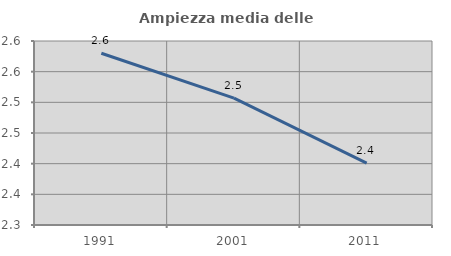
| Category | Ampiezza media delle famiglie |
|---|---|
| 1991.0 | 2.58 |
| 2001.0 | 2.507 |
| 2011.0 | 2.401 |